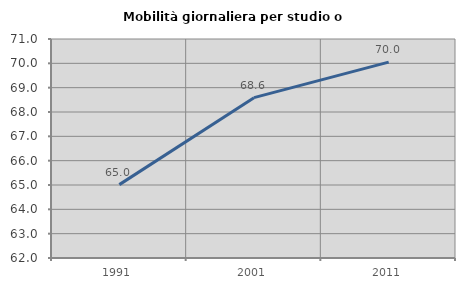
| Category | Mobilità giornaliera per studio o lavoro |
|---|---|
| 1991.0 | 65.015 |
| 2001.0 | 68.589 |
| 2011.0 | 70.05 |